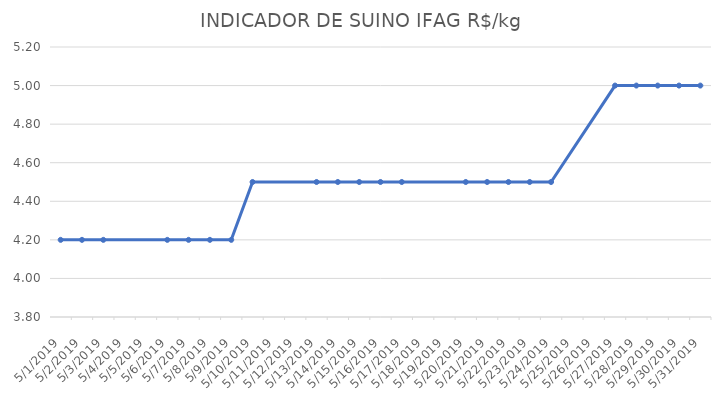
| Category | INDICADOR DE SUINO IFAG |
|---|---|
| 5/1/19 | 4.2 |
| 5/2/19 | 4.2 |
| 5/3/19 | 4.2 |
| 5/6/19 | 4.2 |
| 5/7/19 | 4.2 |
| 5/8/19 | 4.2 |
| 5/9/19 | 4.2 |
| 5/10/19 | 4.5 |
| 5/13/19 | 4.5 |
| 5/14/19 | 4.5 |
| 5/15/19 | 4.5 |
| 5/16/19 | 4.5 |
| 5/17/19 | 4.5 |
| 5/20/19 | 4.5 |
| 5/21/19 | 4.5 |
| 5/22/19 | 4.5 |
| 5/23/19 | 4.5 |
| 5/24/19 | 4.5 |
| 5/27/19 | 5 |
| 5/28/19 | 5 |
| 5/29/19 | 5 |
| 5/30/19 | 5 |
| 5/31/19 | 5 |